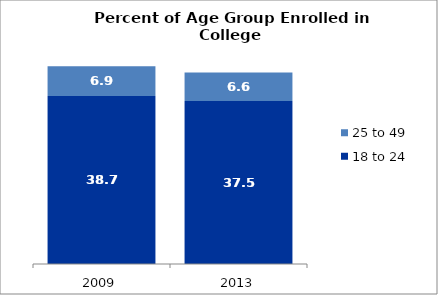
| Category | 18 to 24 | 25 to 49 |
|---|---|---|
| 2009.0 | 38.683 | 6.877 |
| 2013.0 | 37.531 | 6.584 |